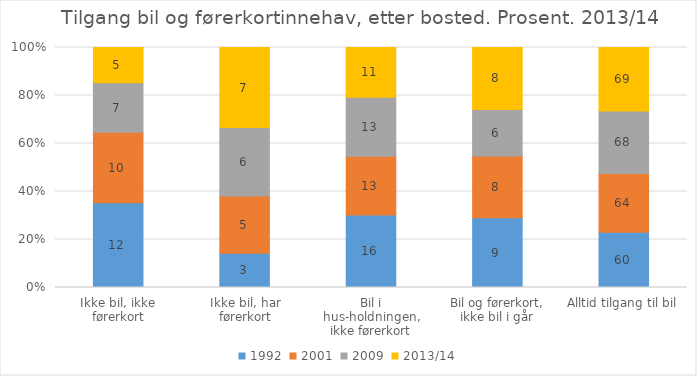
| Category | 1992 | 2001 | 2009 | 2013/14 |
|---|---|---|---|---|
| Ikke bil, ikke førerkort | 12 | 10 | 7 | 5 |
| Ikke bil, har førerkort | 3 | 5 | 6 | 7 |
| Bil i hus-holdningen, ikke førerkort | 16 | 13 | 13 | 11 |
| Bil og førerkort, ikke bil i går | 9 | 8 | 6 | 8 |
| Alltid tilgang til bil | 60 | 64 | 68 | 69 |